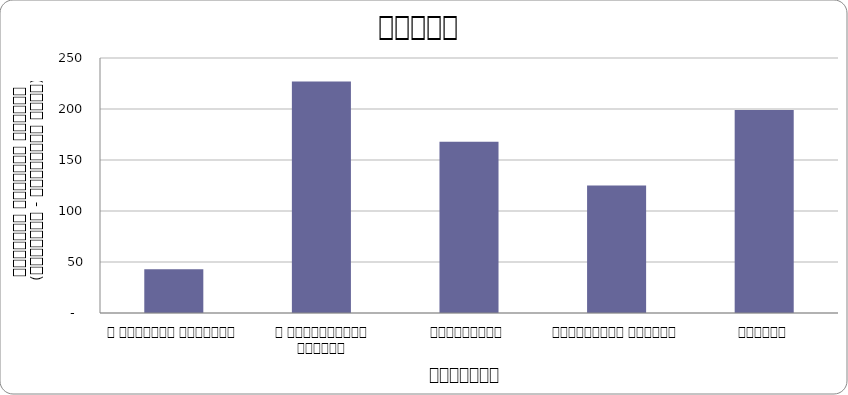
| Category | Series 0 |
|---|---|
| द हिमालयन टाइम्स् | 43 |
| द काठमाण्डौं पोस्ट् | 227 |
| कान्तिपुर | 168 |
| अन्नपूर्ण पोस्ट् | 125 |
| नागरिक | 199 |